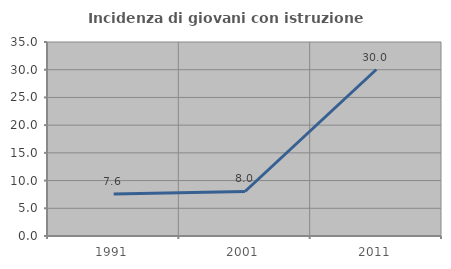
| Category | Incidenza di giovani con istruzione universitaria |
|---|---|
| 1991.0 | 7.568 |
| 2001.0 | 8.029 |
| 2011.0 | 30.038 |